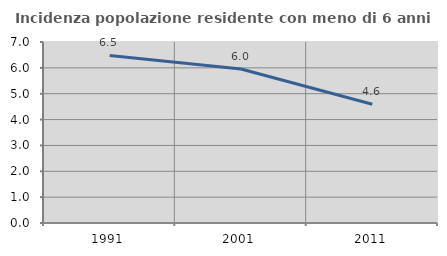
| Category | Incidenza popolazione residente con meno di 6 anni |
|---|---|
| 1991.0 | 6.479 |
| 2001.0 | 5.956 |
| 2011.0 | 4.593 |